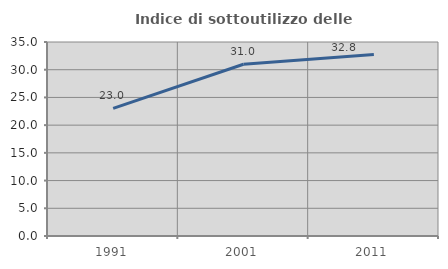
| Category | Indice di sottoutilizzo delle abitazioni  |
|---|---|
| 1991.0 | 23.036 |
| 2001.0 | 30.993 |
| 2011.0 | 32.765 |